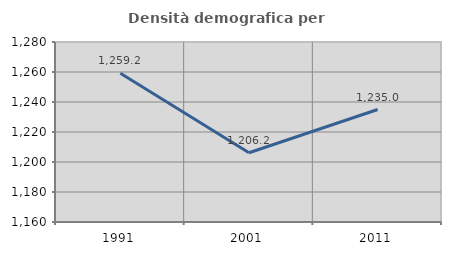
| Category | Densità demografica |
|---|---|
| 1991.0 | 1259.175 |
| 2001.0 | 1206.163 |
| 2011.0 | 1234.999 |